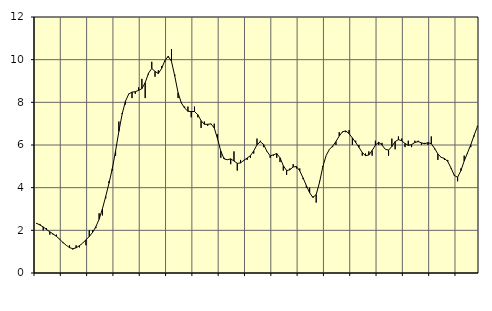
| Category | Piggar | Series 1 |
|---|---|---|
| nan | 2.3 | 2.33 |
| 87.0 | 2.3 | 2.25 |
| 87.0 | 2 | 2.16 |
| 87.0 | 2.1 | 2.04 |
| nan | 1.8 | 1.93 |
| 88.0 | 1.8 | 1.83 |
| 88.0 | 1.8 | 1.72 |
| 88.0 | 1.6 | 1.58 |
| nan | 1.4 | 1.43 |
| 89.0 | 1.3 | 1.3 |
| 89.0 | 1.3 | 1.19 |
| 89.0 | 1.1 | 1.14 |
| nan | 1.3 | 1.18 |
| 90.0 | 1.2 | 1.28 |
| 90.0 | 1.4 | 1.4 |
| 90.0 | 1.3 | 1.56 |
| nan | 2 | 1.71 |
| 91.0 | 2 | 1.9 |
| 91.0 | 2.1 | 2.17 |
| 91.0 | 2.8 | 2.52 |
| nan | 2.7 | 3.01 |
| 92.0 | 3.5 | 3.59 |
| 92.0 | 4.3 | 4.21 |
| 92.0 | 4.8 | 4.89 |
| nan | 5.5 | 5.72 |
| 93.0 | 7.1 | 6.64 |
| 93.0 | 7.5 | 7.45 |
| 93.0 | 7.9 | 8.05 |
| nan | 8.4 | 8.39 |
| 94.0 | 8.2 | 8.48 |
| 94.0 | 8.4 | 8.5 |
| 94.0 | 8.7 | 8.56 |
| nan | 9.1 | 8.64 |
| 95.0 | 8.2 | 8.92 |
| 95.0 | 9.3 | 9.36 |
| 95.0 | 9.9 | 9.59 |
| nan | 9.2 | 9.45 |
| 96.0 | 9.5 | 9.35 |
| 96.0 | 9.7 | 9.59 |
| 96.0 | 9.9 | 9.96 |
| nan | 10.1 | 10.16 |
| 97.0 | 10.5 | 9.92 |
| 97.0 | 9.3 | 9.23 |
| 97.0 | 8.2 | 8.45 |
| nan | 8 | 7.97 |
| 98.0 | 7.8 | 7.73 |
| 98.0 | 7.8 | 7.58 |
| 98.0 | 7.3 | 7.57 |
| nan | 7.8 | 7.57 |
| 99.0 | 7.3 | 7.42 |
| 99.0 | 6.8 | 7.14 |
| 99.0 | 7.1 | 6.97 |
| nan | 6.9 | 6.97 |
| 0.0 | 7 | 6.99 |
| 0.0 | 7 | 6.8 |
| 0.0 | 6.5 | 6.29 |
| nan | 5.4 | 5.71 |
| 1.0 | 5.4 | 5.35 |
| 1.0 | 5.3 | 5.31 |
| 1.0 | 5.1 | 5.35 |
| nan | 5.7 | 5.25 |
| 2.0 | 4.8 | 5.14 |
| 2.0 | 5.3 | 5.16 |
| 2.0 | 5.3 | 5.28 |
| nan | 5.3 | 5.39 |
| 3.0 | 5.4 | 5.5 |
| 3.0 | 5.6 | 5.72 |
| 3.0 | 6.3 | 6.01 |
| nan | 6.2 | 6.15 |
| 4.0 | 5.9 | 6.03 |
| 4.0 | 5.7 | 5.71 |
| 4.0 | 5.4 | 5.49 |
| nan | 5.5 | 5.54 |
| 5.0 | 5.4 | 5.6 |
| 5.0 | 5.2 | 5.4 |
| 5.0 | 4.8 | 5.03 |
| nan | 4.6 | 4.8 |
| 6.0 | 4.9 | 4.84 |
| 6.0 | 5.1 | 4.97 |
| 6.0 | 4.9 | 4.99 |
| nan | 4.9 | 4.79 |
| 7.0 | 4.4 | 4.46 |
| 7.0 | 4 | 4.1 |
| 7.0 | 4 | 3.76 |
| nan | 3.6 | 3.54 |
| 8.0 | 3.3 | 3.68 |
| 8.0 | 4.3 | 4.24 |
| 8.0 | 5 | 4.97 |
| nan | 5.5 | 5.5 |
| 9.0 | 5.8 | 5.79 |
| 9.0 | 5.9 | 5.95 |
| 9.0 | 6 | 6.16 |
| nan | 6.6 | 6.42 |
| 10.0 | 6.6 | 6.62 |
| 10.0 | 6.6 | 6.66 |
| 10.0 | 6.7 | 6.53 |
| nan | 6 | 6.33 |
| 11.0 | 6.2 | 6.12 |
| 11.0 | 6 | 5.89 |
| 11.0 | 5.5 | 5.65 |
| nan | 5.6 | 5.5 |
| 12.0 | 5.7 | 5.53 |
| 12.0 | 5.5 | 5.74 |
| 12.0 | 6.2 | 5.99 |
| nan | 6 | 6.13 |
| 13.0 | 6.1 | 6 |
| 13.0 | 5.8 | 5.8 |
| 13.0 | 5.5 | 5.76 |
| nan | 6.3 | 5.93 |
| 14.0 | 5.8 | 6.16 |
| 14.0 | 6.4 | 6.25 |
| 14.0 | 6.3 | 6.2 |
| nan | 5.9 | 6.07 |
| 15.0 | 6.2 | 5.98 |
| 15.0 | 5.9 | 6.02 |
| 15.0 | 6.2 | 6.12 |
| nan | 6.2 | 6.16 |
| 16.0 | 6 | 6.1 |
| 16.0 | 6.1 | 6.06 |
| 16.0 | 6 | 6.11 |
| nan | 6.4 | 6.06 |
| 17.0 | 5.8 | 5.84 |
| 17.0 | 5.3 | 5.58 |
| 17.0 | 5.4 | 5.42 |
| nan | 5.3 | 5.37 |
| 18.0 | 5.3 | 5.23 |
| 18.0 | 4.9 | 4.92 |
| 18.0 | 4.6 | 4.57 |
| nan | 4.3 | 4.49 |
| 19.0 | 4.9 | 4.8 |
| 19.0 | 5.5 | 5.25 |
| 19.0 | 5.6 | 5.63 |
| nan | 5.9 | 6.01 |
| 20.0 | 6.4 | 6.45 |
| 20.0 | 6.9 | 6.85 |